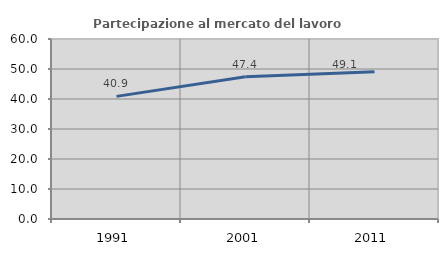
| Category | Partecipazione al mercato del lavoro  femminile |
|---|---|
| 1991.0 | 40.87 |
| 2001.0 | 47.401 |
| 2011.0 | 49.105 |